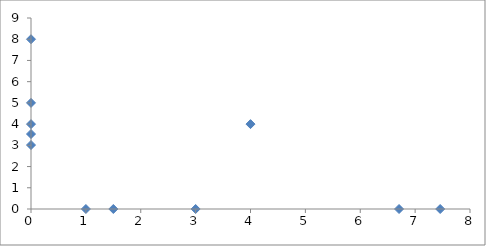
| Category | Series 0 |
|---|---|
| 4.0 | 4 |
| 6.706730769230769 | 0 |
| 0.0 | 3.014 |
| 7.456730769230769 | 0 |
| 0.0 | 3.534 |
| 1.0 | 0 |
| 0.0 | 8 |
| 3.0 | 0 |
| 0.0 | 5 |
| 1.5 | 0 |
| 0.0 | 4 |